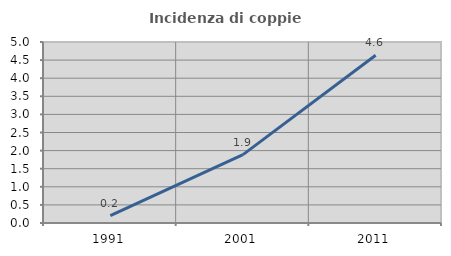
| Category | Incidenza di coppie miste |
|---|---|
| 1991.0 | 0.205 |
| 2001.0 | 1.89 |
| 2011.0 | 4.633 |